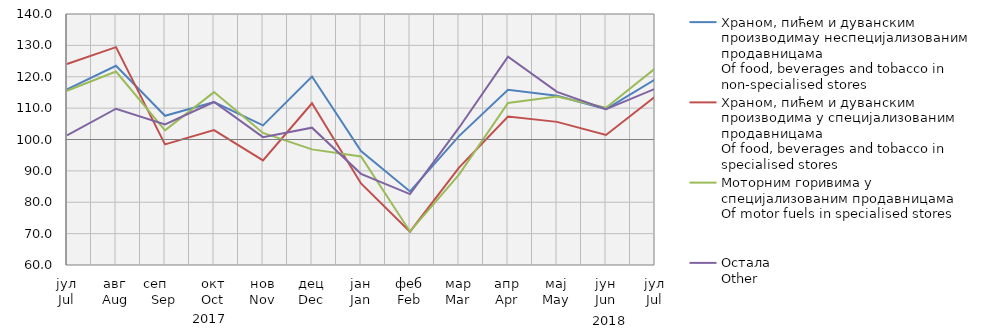
| Category | Храном, пићем и дуванским производимау неспецијализованим продавницама
Of food, beverages and tobacco in non-specialised stores
 | Храном, пићем и дуванским производима у специјализовaним продавницама
Of food, beverages and tobacco in specialised stores | Моторним горивима у специјализованим продавницама
Of motor fuels in specialised stores | Остала
Other |
|---|---|---|---|---|
| јул
Jul | 115.952 | 124.078 | 115.551 | 101.353 |
| авг
Aug | 123.494 | 129.435 | 121.673 | 109.807 |
| сеп     Sep | 107.568 | 98.457 | 102.908 | 104.789 |
| окт
Oct | 111.938 | 102.999 | 115.109 | 111.951 |
| нов
Nov | 104.514 | 93.335 | 102.083 | 100.762 |
| дец
Dec | 120.059 | 111.537 | 96.853 | 103.773 |
| јан
Jan | 96.298 | 85.996 | 94.588 | 89.066 |
| феб
Feb | 83.434 | 70.608 | 70.699 | 82.588 |
| мар
Mar | 101.078 | 91.052 | 88.818 | 103.76 |
| апр
Apr | 115.827 | 107.304 | 111.624 | 126.386 |
| мај
May | 113.922 | 105.62 | 113.677 | 115.161 |
| јун
Jun | 109.695 | 101.443 | 110.116 | 109.637 |
| јул
Jul | 119.106 | 113.628 | 122.61 | 116.148 |